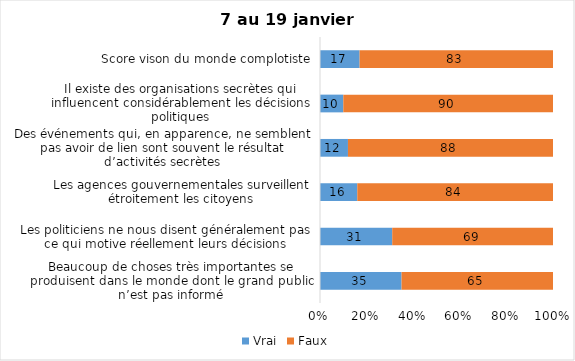
| Category | Vrai | Faux |
|---|---|---|
| Beaucoup de choses très importantes se produisent dans le monde dont le grand public n’est pas informé | 35 | 65 |
| Les politiciens ne nous disent généralement pas ce qui motive réellement leurs décisions | 31 | 69 |
| Les agences gouvernementales surveillent étroitement les citoyens | 16 | 84 |
| Des événements qui, en apparence, ne semblent pas avoir de lien sont souvent le résultat d’activités secrètes | 12 | 88 |
| Il existe des organisations secrètes qui influencent considérablement les décisions politiques | 10 | 90 |
| Score vison du monde complotiste | 17 | 83 |